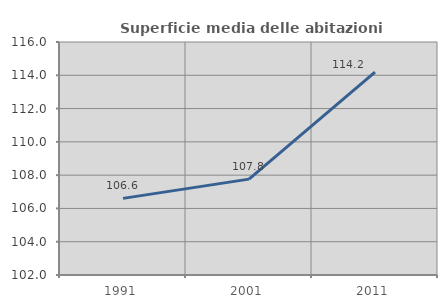
| Category | Superficie media delle abitazioni occupate |
|---|---|
| 1991.0 | 106.604 |
| 2001.0 | 107.762 |
| 2011.0 | 114.188 |